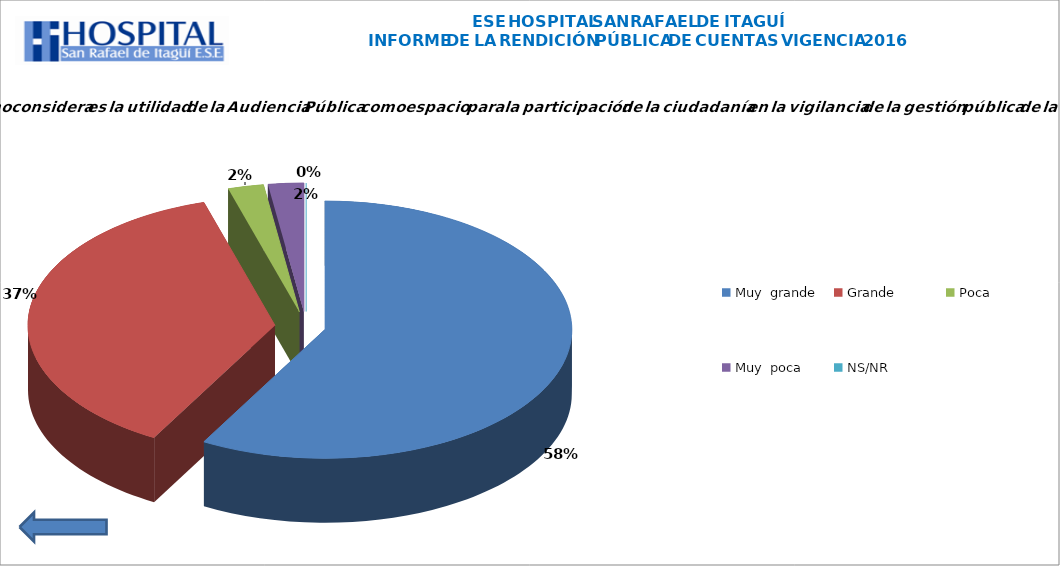
| Category | Series 0 |
|---|---|
| Muy  grande  | 25 |
| Grande | 16 |
| Poca | 1 |
| Muy  poca | 1 |
| NS/NR | 0 |